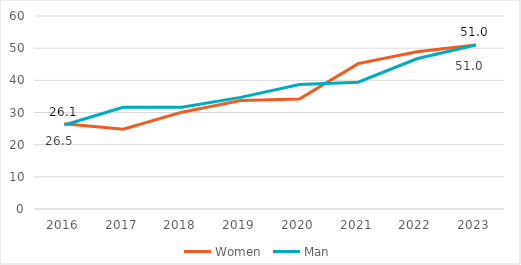
| Category | Women | Man |
|---|---|---|
| 2016.0 | 26.5 | 26.1 |
| 2017.0 | 24.8 | 31.6 |
| 2018.0 | 30.1 | 31.6 |
| 2019.0 | 33.7 | 34.7 |
| 2020.0 | 34.2 | 38.7 |
| 2021.0 | 45.2 | 39.4 |
| 2022.0 | 48.9 | 46.7 |
| 2023.0 | 51 | 51 |